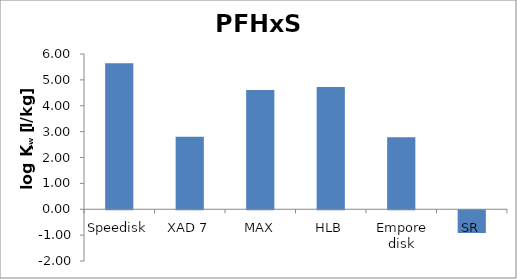
| Category | PFHxS  |
|---|---|
| Speedisk | 5.643 |
| XAD 7 | 2.805 |
| MAX | 4.606 |
| HLB | 4.728 |
| Empore disk | 2.783 |
| SR | -0.879 |